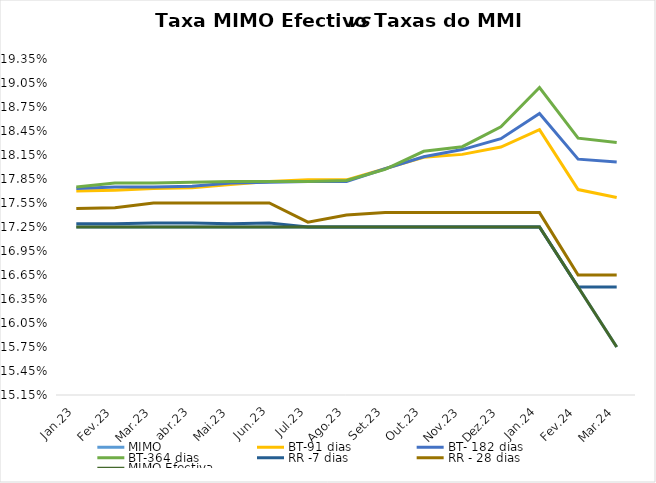
| Category | MIMO | BT-91 dias | BT- 182 dias | BT-364 dias | RR -7 dias | RR - 28 dias | MIMO Efectiva |
|---|---|---|---|---|---|---|---|
| Jan.23 | 0.172 | 0.177 | 0.177 | 0.178 | 0.173 | 0.175 | 0.172 |
| Fev.23 | 0.172 | 0.177 | 0.178 | 0.178 | 0.173 | 0.175 | 0.172 |
| Mar.23 | 0.172 | 0.177 | 0.178 | 0.178 | 0.173 | 0.176 | 0.172 |
| abr.23 | 0.172 | 0.177 | 0.178 | 0.178 | 0.173 | 0.176 | 0.172 |
| Mai.23 | 0.172 | 0.178 | 0.178 | 0.178 | 0.173 | 0.176 | 0.172 |
| Jun.23 | 0.172 | 0.178 | 0.178 | 0.178 | 0.173 | 0.176 | 0.172 |
| Jul.23 | 0.172 | 0.178 | 0.178 | 0.178 | 0.172 | 0.173 | 0.172 |
| Ago.23 | 0.172 | 0.178 | 0.178 | 0.178 | 0.172 | 0.174 | 0.172 |
| Set.23 | 0.172 | 0.18 | 0.18 | 0.18 | 0.172 | 0.174 | 0.172 |
| Out.23 | 0.172 | 0.181 | 0.181 | 0.182 | 0.172 | 0.174 | 0.172 |
| Nov.23 | 0.172 | 0.182 | 0.182 | 0.183 | 0.172 | 0.174 | 0.172 |
| Dez.23 | 0.172 | 0.182 | 0.184 | 0.185 | 0.172 | 0.174 | 0.172 |
| Jan.24 | 0.172 | 0.185 | 0.187 | 0.19 | 0.172 | 0.174 | 0.172 |
| Fev.24 | 0.165 | 0.177 | 0.181 | 0.184 | 0.165 | 0.166 | 0.165 |
| Mar.24 | 0.158 | 0.176 | 0.181 | 0.183 | 0.165 | 0.166 | 0.158 |